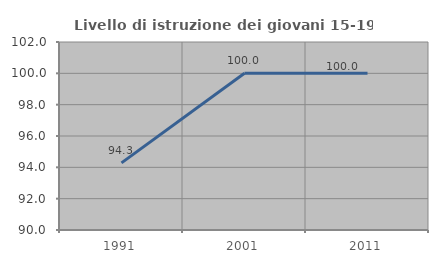
| Category | Livello di istruzione dei giovani 15-19 anni |
|---|---|
| 1991.0 | 94.286 |
| 2001.0 | 100 |
| 2011.0 | 100 |